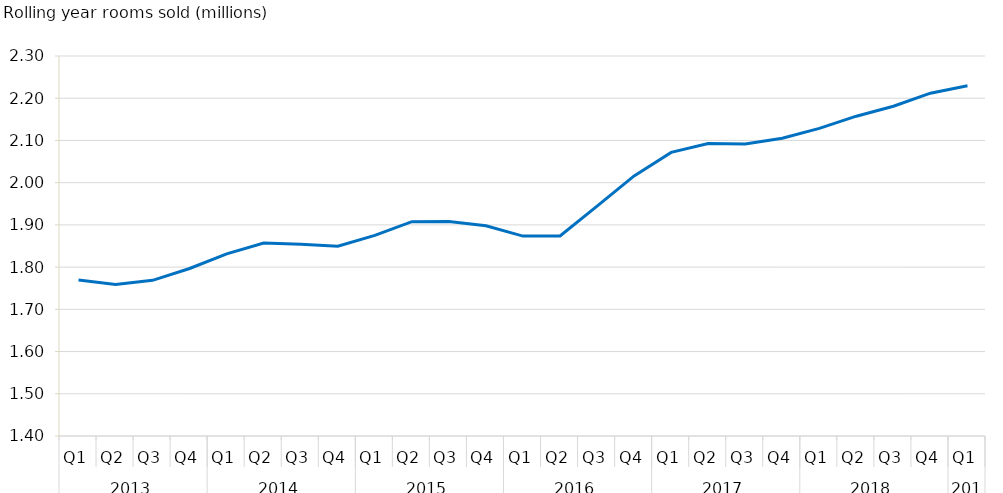
| Category | Series 0 |
|---|---|
| 0 | 1769588.225 |
| 1 | 1758950.115 |
| 2 | 1768672.827 |
| 3 | 1796703.317 |
| 4 | 1831335.384 |
| 5 | 1857225.461 |
| 6 | 1854028.286 |
| 7 | 1849521.422 |
| 8 | 1875195.63 |
| 9 | 1907646.356 |
| 10 | 1907929.166 |
| 11 | 1897876.32 |
| 12 | 1873411.233 |
| 13 | 1873676.965 |
| 14 | 1944377.589 |
| 15 | 2016024.39 |
| 16 | 2071677.816 |
| 17 | 2092588.888 |
| 18 | 2091495.934 |
| 19 | 2105193.618 |
| 20 | 2128500.401 |
| 21 | 2157475.24 |
| 22 | 2180901.468 |
| 23 | 2211912.279 |
| 24 | 2229625.111 |